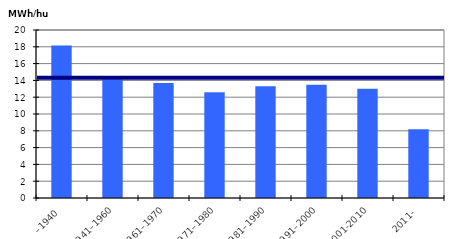
| Category | MWH/hus |
|---|---|
| –1940 | 18.142 |
| 1941–1960 | 14.119 |
| 1961–1970 | 13.703 |
| 1971–1980 | 12.601 |
| 1981–1990 | 13.312 |
| 1991–2000 | 13.488 |
| 2001-2010 | 12.996 |
| 2011- | 8.199 |